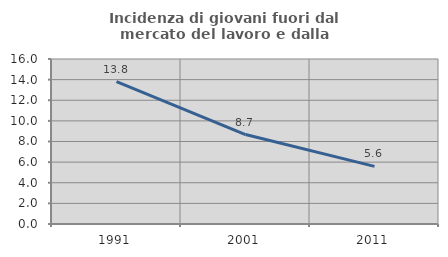
| Category | Incidenza di giovani fuori dal mercato del lavoro e dalla formazione  |
|---|---|
| 1991.0 | 13.816 |
| 2001.0 | 8.676 |
| 2011.0 | 5.584 |